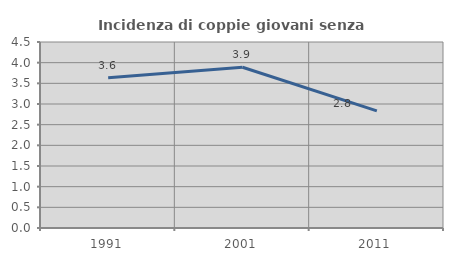
| Category | Incidenza di coppie giovani senza figli |
|---|---|
| 1991.0 | 3.636 |
| 2001.0 | 3.888 |
| 2011.0 | 2.833 |